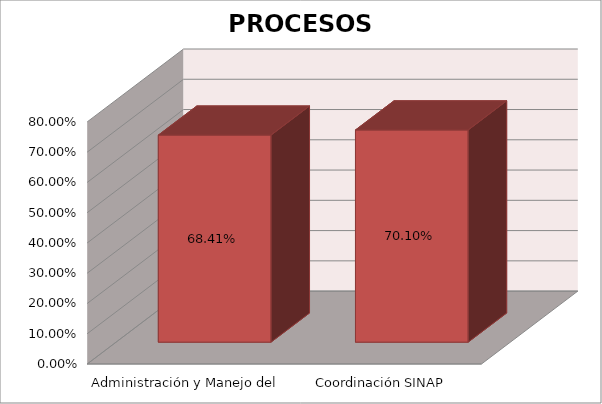
| Category | Series 0 |
|---|---|
| Administración y Manejo del SPNN | 0.684 |
| Coordinación SINAP | 0.701 |